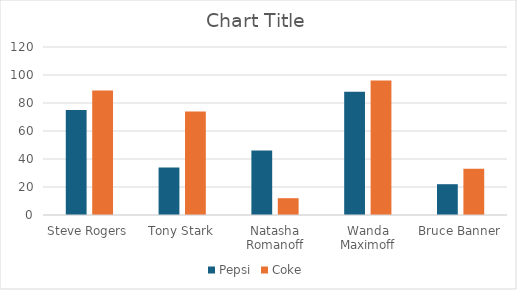
| Category | Pepsi | Coke |
|---|---|---|
| Steve Rogers | 75 | 89 |
| Tony Stark | 34 | 74 |
| Natasha Romanoff | 46 | 12 |
| Wanda Maximoff | 88 | 96 |
| Bruce Banner | 22 | 33 |